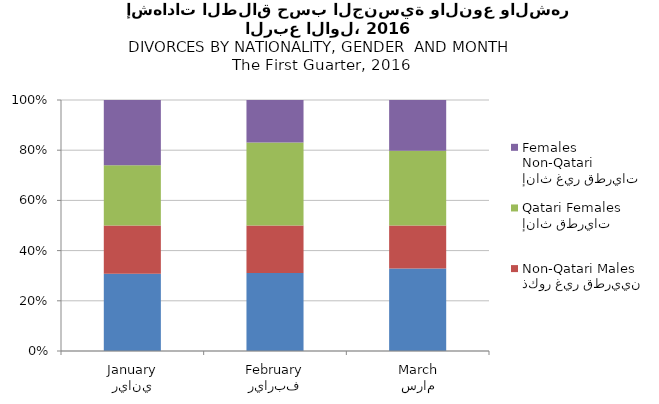
| Category | ذكور قطريون
Qatari Males | ذكور غير قطريين
Non-Qatari Males | إناث قطريات
Qatari Females | إناث غير قطريات
Non-Qatari Females |
|---|---|---|---|---|
| يناير
January | 45 | 28 | 35 | 38 |
| فبراير
February | 46 | 28 | 49 | 25 |
| مارس
March | 65 | 34 | 59 | 40 |